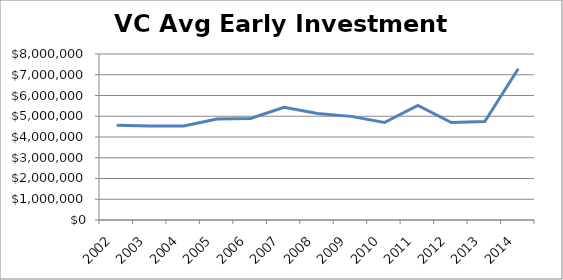
| Category | Series 0 |
|---|---|
| 2002.0 | 4562008.126 |
| 2003.0 | 4525701.605 |
| 2004.0 | 4525654.405 |
| 2005.0 | 4861751.543 |
| 2006.0 | 4890627.668 |
| 2007.0 | 5428572.174 |
| 2008.0 | 5128695.145 |
| 2009.0 | 4994342.111 |
| 2010.0 | 4698538.744 |
| 2011.0 | 5516809.415 |
| 2012.0 | 4699684.738 |
| 2013.0 | 4743432.05 |
| 2014.0 | 7292666.544 |